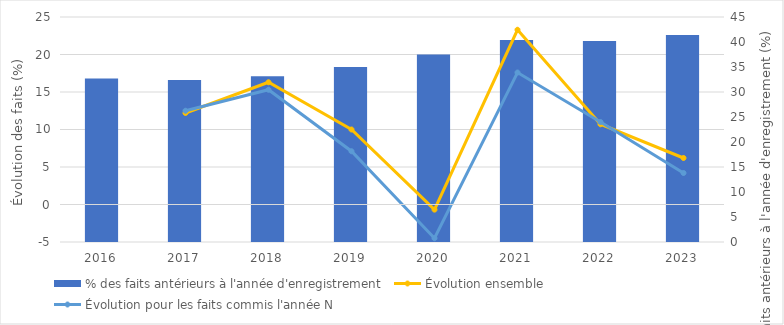
| Category | % des faits antérieurs à l'année d'enregistrement |
|---|---|
| 2016.0 | 32.7 |
| 2017.0 | 32.4 |
| 2018.0 | 33.15 |
| 2019.0 | 35 |
| 2020.0 | 37.5 |
| 2021.0 | 40.4 |
| 2022.0 | 40.2 |
| 2023.0 | 41.4 |